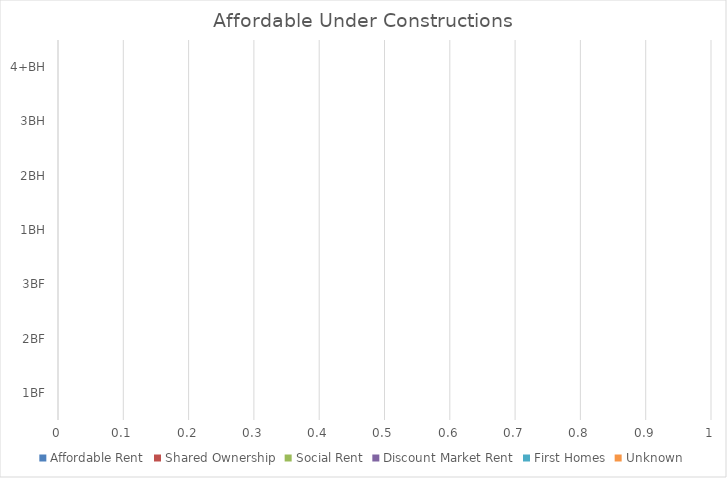
| Category | Affordable Rent | Shared Ownership | Social Rent | Discount Market Rent | First Homes | Unknown |
|---|---|---|---|---|---|---|
| 1BF | 0 | 0 | 0 | 0 | 0 | 0 |
| 2BF | 0 | 0 | 0 | 0 | 0 | 0 |
| 3BF | 0 | 0 | 0 | 0 | 0 | 0 |
| 1BH | 0 | 0 | 0 | 0 | 0 | 0 |
| 2BH | 0 | 0 | 0 | 0 | 0 | 0 |
| 3BH | 0 | 0 | 0 | 0 | 0 | 0 |
| 4+BH | 0 | 0 | 0 | 0 | 0 | 0 |